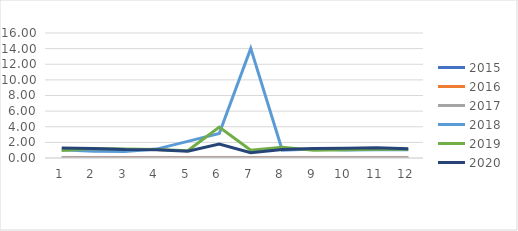
| Category | 2015 | 2016 | 2017 | 2018 | 2019 | 2020 |
|---|---|---|---|---|---|---|
| 0 | 0 | 0 | 0 | 1.046 | 0.947 | 1.28 |
| 1 | 0 | 0 | 0 | 0.879 | 1.217 | 1.227 |
| 2 | 0 | 0 | 0 | 0.831 | 1.153 | 1.078 |
| 3 | 0 | 0 | 0 | 1.139 | 1.102 | 1.062 |
| 4 | 0 | 0 | 0 | 2.128 | 0.935 | 0.865 |
| 5 | 0 | 0 | 0 | 3.14 | 3.958 | 1.782 |
| 6 | 0 | 0 | 0 | 14.025 | 0.989 | 0.675 |
| 7 | 0 | 0 | 0 | 0.993 | 1.373 | 1.079 |
| 8 | 0 | 0 | 0 | 1.138 | 0.995 | 1.208 |
| 9 | 0 | 0 | 0 | 1.019 | 1.052 | 1.251 |
| 10 | 0 | 0 | 0 | 1.046 | 1.126 | 1.305 |
| 11 | 0 | 0 | 0 | 1.05 | 1.133 | 1.178 |